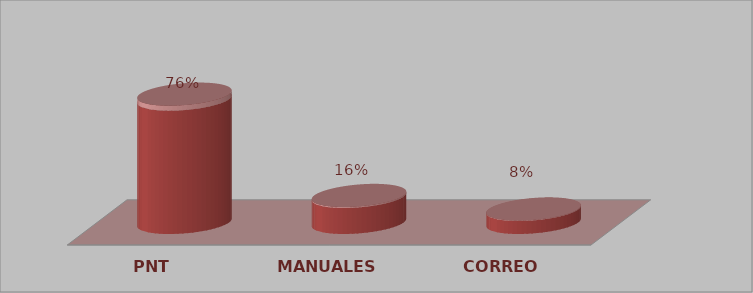
| Category | Series 0 | Series 1 |
|---|---|---|
| PNT | 19 | 0.76 |
| MANUALES | 4 | 0.16 |
| CORREO | 2 | 0.08 |